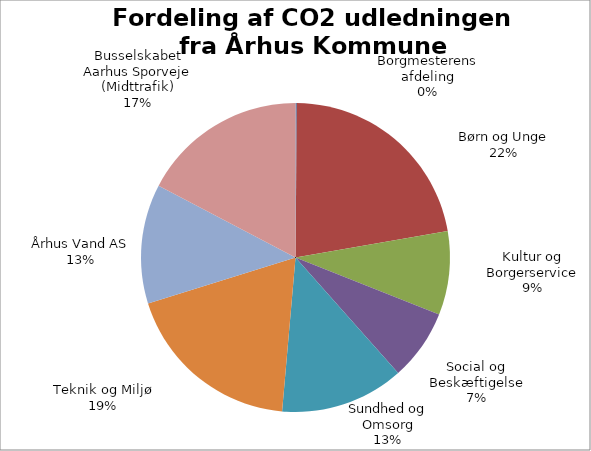
| Category | Ton CO2 | % af total |
|---|---|---|
| Borgmesterens afdeling | 149.789 | 0.137 |
| Børn og Unge | 24110.836 | 22.11 |
| Kultur og Borgerservice | 9565.206 | 8.772 |
| Social og Beskæftigelse | 8092.383 | 7.421 |
| Sundhed og Omsorg | 14115.304 | 12.944 |
| Teknik og Miljø | 20502.144 | 18.801 |
| Århus Vand AS | 13626.296 | 12.496 |
| Busselskabet Aarhus Sporveje (Midttrafik) | 18885.52 | 17.319 |